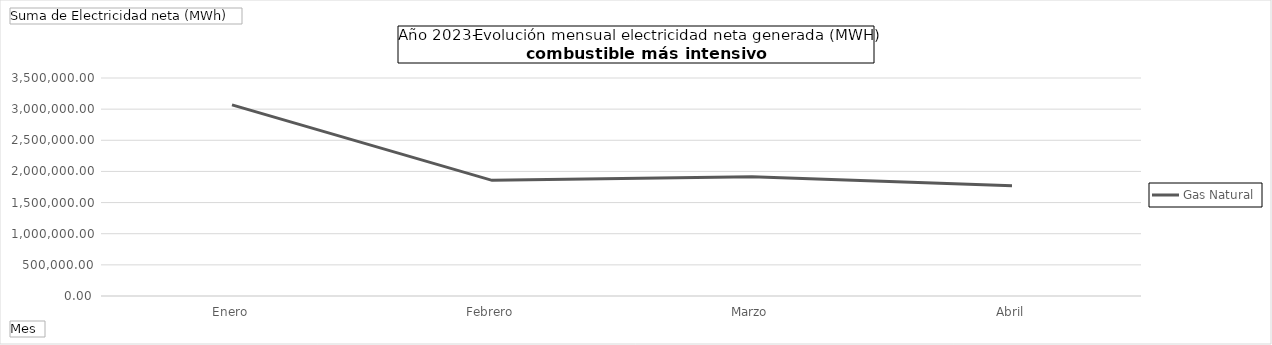
| Category | Gas Natural |
|---|---|
| Enero | 3067602.553 |
| Febrero | 1856625.627 |
| Marzo | 1913321.76 |
| Abril | 1770526.91 |